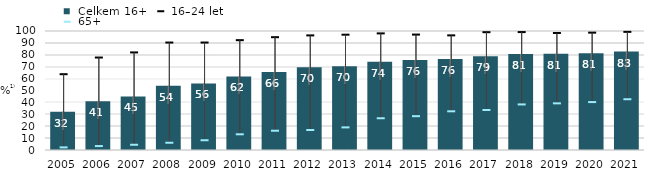
| Category |  Celkem 16+ |
|---|---|
| 2005.0 | 32.1 |
| 2006.0 | 41 |
| 2007.0 | 45 |
| 2008.0 | 54 |
| 2009.0 | 55.9 |
| 2010.0 | 61.8 |
| 2011.0 | 65.5 |
| 2012.0 | 69.5 |
| 2013.0 | 70.4 |
| 2014.0 | 74.232 |
| 2015.0 | 75.669 |
| 2016.0 | 76.481 |
| 2017.0 | 78.8 |
| 2018.0 | 80.7 |
| 2019.0 | 80.9 |
| 2020.0 | 81.339 |
| 2021.0 | 82.671 |